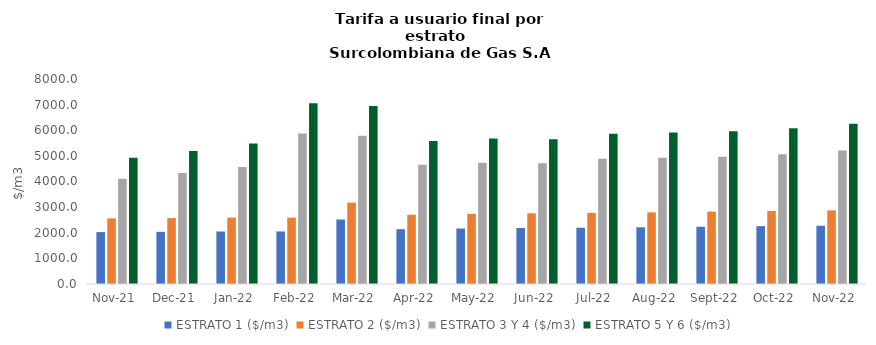
| Category | ESTRATO 1 ($/m3) | ESTRATO 2 ($/m3) | ESTRATO 3 Y 4 ($/m3) | ESTRATO 5 Y 6 ($/m3) |
|---|---|---|---|---|
| 2021-11-01 | 2025.39 | 2558.97 | 4104.53 | 4925.436 |
| 2021-12-01 | 2035.33 | 2571.52 | 4328.76 | 5194.512 |
| 2022-01-01 | 2050.23 | 2590.35 | 4570.18 | 5484.216 |
| 2022-02-01 | 2050.23 | 2590.35 | 5875.34 | 7050.408 |
| 2022-03-01 | 2515.36 | 3176.09 | 5787.27 | 6944.724 |
| 2022-04-01 | 2139.49 | 2703.12 | 4649.66 | 5579.592 |
| 2022-05-01 | 2166.17 | 2736.83 | 4735.45 | 5682.54 |
| 2022-06-01 | 2184.39 | 2759.85 | 4711.05 | 5653.26 |
| 2022-07-01 | 2195.62 | 2774.03 | 4889.25 | 5867.1 |
| 2022-08-01 | 2213.28 | 2796.36 | 4927.85 | 5913.42 |
| 2022-09-01 | 2235.92 | 2824.95 | 4968.53 | 5962.236 |
| 2022-10-01 | 2256.71 | 2851.23 | 5063.68 | 6076.416 |
| 2022-11-01 | 2272.91 | 2871.69 | 5208.48 | 6250.176 |